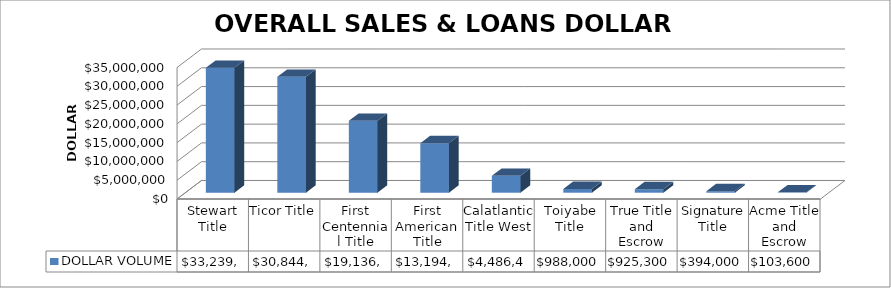
| Category | DOLLAR VOLUME |
|---|---|
| Stewart Title | 33239605 |
| Ticor Title | 30844591 |
| First Centennial Title | 19136534.29 |
| First American Title | 13194889 |
| Calatlantic Title West | 4486482 |
| Toiyabe Title | 988000 |
| True Title and Escrow | 925300 |
| Signature Title | 394000 |
| Acme Title and Escrow | 103600 |